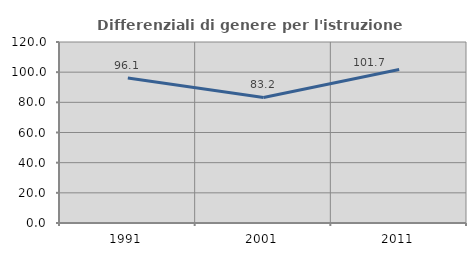
| Category | Differenziali di genere per l'istruzione superiore |
|---|---|
| 1991.0 | 96.131 |
| 2001.0 | 83.231 |
| 2011.0 | 101.72 |